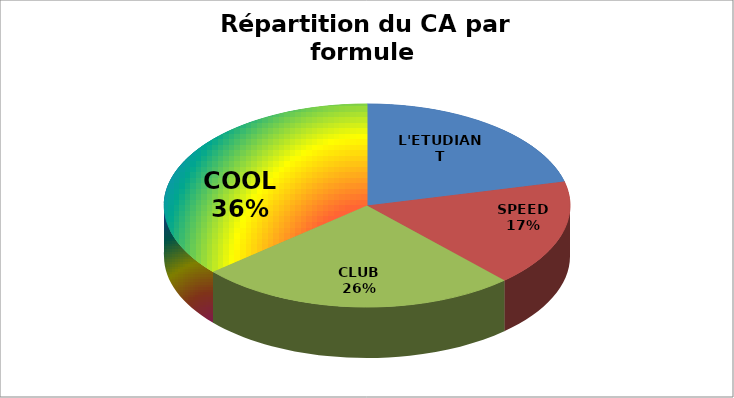
| Category | Series 0 |
|---|---|
| L'ETUDIANT | 1144 |
| SPEED | 917 |
| CLUB | 1377 |
| COOL | 1960 |